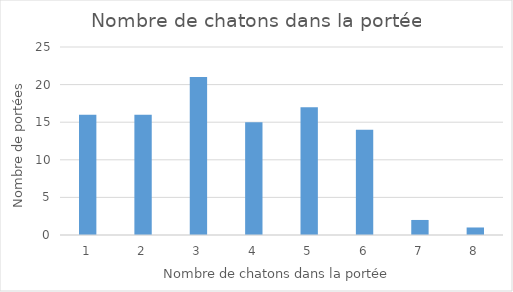
| Category | Series 0 |
|---|---|
| 1.0 | 16 |
| 2.0 | 16 |
| 3.0 | 21 |
| 4.0 | 15 |
| 5.0 | 17 |
| 6.0 | 14 |
| 7.0 | 2 |
| 8.0 | 1 |